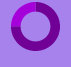
| Category | TOTAL CLIENT SATISFACTION |
|---|---|
| 0 | 0.752 |
| 1 | 0.248 |